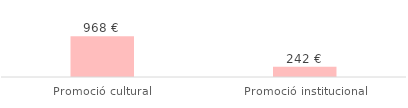
| Category | Total |
|---|---|
| Promoció cultural | 968 |
| Promoció institucional | 242 |